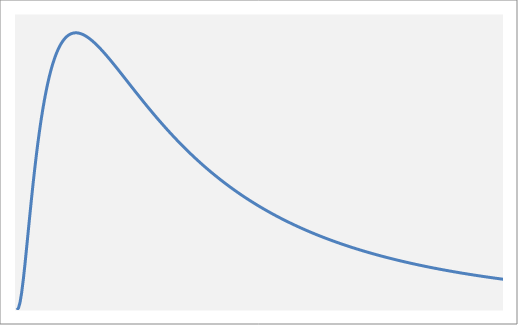
| Category | Series 0 |
|---|---|
| 0 | 0 |
| 1 | 0 |
| 2 | 0 |
| 3 | 0 |
| 4 | 0.001 |
| 5 | 0.001 |
| 6 | 0.001 |
| 7 | 0.002 |
| 8 | 0.002 |
| 9 | 0.003 |
| 10 | 0.003 |
| 11 | 0.003 |
| 12 | 0.004 |
| 13 | 0.004 |
| 14 | 0.004 |
| 15 | 0.005 |
| 16 | 0.005 |
| 17 | 0.005 |
| 18 | 0.005 |
| 19 | 0.005 |
| 20 | 0.006 |
| 21 | 0.006 |
| 22 | 0.006 |
| 23 | 0.006 |
| 24 | 0.006 |
| 25 | 0.006 |
| 26 | 0.006 |
| 27 | 0.006 |
| 28 | 0.006 |
| 29 | 0.006 |
| 30 | 0.006 |
| 31 | 0.006 |
| 32 | 0.007 |
| 33 | 0.007 |
| 34 | 0.007 |
| 35 | 0.007 |
| 36 | 0.007 |
| 37 | 0.007 |
| 38 | 0.007 |
| 39 | 0.007 |
| 40 | 0.007 |
| 41 | 0.007 |
| 42 | 0.007 |
| 43 | 0.006 |
| 44 | 0.006 |
| 45 | 0.006 |
| 46 | 0.006 |
| 47 | 0.006 |
| 48 | 0.006 |
| 49 | 0.006 |
| 50 | 0.006 |
| 51 | 0.006 |
| 52 | 0.006 |
| 53 | 0.006 |
| 54 | 0.006 |
| 55 | 0.006 |
| 56 | 0.006 |
| 57 | 0.006 |
| 58 | 0.006 |
| 59 | 0.006 |
| 60 | 0.006 |
| 61 | 0.006 |
| 62 | 0.006 |
| 63 | 0.006 |
| 64 | 0.006 |
| 65 | 0.006 |
| 66 | 0.006 |
| 67 | 0.005 |
| 68 | 0.005 |
| 69 | 0.005 |
| 70 | 0.005 |
| 71 | 0.005 |
| 72 | 0.005 |
| 73 | 0.005 |
| 74 | 0.005 |
| 75 | 0.005 |
| 76 | 0.005 |
| 77 | 0.005 |
| 78 | 0.005 |
| 79 | 0.005 |
| 80 | 0.005 |
| 81 | 0.005 |
| 82 | 0.005 |
| 83 | 0.005 |
| 84 | 0.005 |
| 85 | 0.005 |
| 86 | 0.005 |
| 87 | 0.005 |
| 88 | 0.004 |
| 89 | 0.004 |
| 90 | 0.004 |
| 91 | 0.004 |
| 92 | 0.004 |
| 93 | 0.004 |
| 94 | 0.004 |
| 95 | 0.004 |
| 96 | 0.004 |
| 97 | 0.004 |
| 98 | 0.004 |
| 99 | 0.004 |
| 100 | 0.004 |
| 101 | 0.004 |
| 102 | 0.004 |
| 103 | 0.004 |
| 104 | 0.004 |
| 105 | 0.004 |
| 106 | 0.004 |
| 107 | 0.004 |
| 108 | 0.004 |
| 109 | 0.004 |
| 110 | 0.004 |
| 111 | 0.004 |
| 112 | 0.004 |
| 113 | 0.003 |
| 114 | 0.003 |
| 115 | 0.003 |
| 116 | 0.003 |
| 117 | 0.003 |
| 118 | 0.003 |
| 119 | 0.003 |
| 120 | 0.003 |
| 121 | 0.003 |
| 122 | 0.003 |
| 123 | 0.003 |
| 124 | 0.003 |
| 125 | 0.003 |
| 126 | 0.003 |
| 127 | 0.003 |
| 128 | 0.003 |
| 129 | 0.003 |
| 130 | 0.003 |
| 131 | 0.003 |
| 132 | 0.003 |
| 133 | 0.003 |
| 134 | 0.003 |
| 135 | 0.003 |
| 136 | 0.003 |
| 137 | 0.003 |
| 138 | 0.003 |
| 139 | 0.003 |
| 140 | 0.003 |
| 141 | 0.003 |
| 142 | 0.003 |
| 143 | 0.003 |
| 144 | 0.003 |
| 145 | 0.003 |
| 146 | 0.003 |
| 147 | 0.003 |
| 148 | 0.002 |
| 149 | 0.002 |
| 150 | 0.002 |
| 151 | 0.002 |
| 152 | 0.002 |
| 153 | 0.002 |
| 154 | 0.002 |
| 155 | 0.002 |
| 156 | 0.002 |
| 157 | 0.002 |
| 158 | 0.002 |
| 159 | 0.002 |
| 160 | 0.002 |
| 161 | 0.002 |
| 162 | 0.002 |
| 163 | 0.002 |
| 164 | 0.002 |
| 165 | 0.002 |
| 166 | 0.002 |
| 167 | 0.002 |
| 168 | 0.002 |
| 169 | 0.002 |
| 170 | 0.002 |
| 171 | 0.002 |
| 172 | 0.002 |
| 173 | 0.002 |
| 174 | 0.002 |
| 175 | 0.002 |
| 176 | 0.002 |
| 177 | 0.002 |
| 178 | 0.002 |
| 179 | 0.002 |
| 180 | 0.002 |
| 181 | 0.002 |
| 182 | 0.002 |
| 183 | 0.002 |
| 184 | 0.002 |
| 185 | 0.002 |
| 186 | 0.002 |
| 187 | 0.002 |
| 188 | 0.002 |
| 189 | 0.002 |
| 190 | 0.002 |
| 191 | 0.002 |
| 192 | 0.002 |
| 193 | 0.002 |
| 194 | 0.002 |
| 195 | 0.002 |
| 196 | 0.002 |
| 197 | 0.002 |
| 198 | 0.002 |
| 199 | 0.002 |
| 200 | 0.002 |
| 201 | 0.002 |
| 202 | 0.002 |
| 203 | 0.002 |
| 204 | 0.002 |
| 205 | 0.001 |
| 206 | 0.001 |
| 207 | 0.001 |
| 208 | 0.001 |
| 209 | 0.001 |
| 210 | 0.001 |
| 211 | 0.001 |
| 212 | 0.001 |
| 213 | 0.001 |
| 214 | 0.001 |
| 215 | 0.001 |
| 216 | 0.001 |
| 217 | 0.001 |
| 218 | 0.001 |
| 219 | 0.001 |
| 220 | 0.001 |
| 221 | 0.001 |
| 222 | 0.001 |
| 223 | 0.001 |
| 224 | 0.001 |
| 225 | 0.001 |
| 226 | 0.001 |
| 227 | 0.001 |
| 228 | 0.001 |
| 229 | 0.001 |
| 230 | 0.001 |
| 231 | 0.001 |
| 232 | 0.001 |
| 233 | 0.001 |
| 234 | 0.001 |
| 235 | 0.001 |
| 236 | 0.001 |
| 237 | 0.001 |
| 238 | 0.001 |
| 239 | 0.001 |
| 240 | 0.001 |
| 241 | 0.001 |
| 242 | 0.001 |
| 243 | 0.001 |
| 244 | 0.001 |
| 245 | 0.001 |
| 246 | 0.001 |
| 247 | 0.001 |
| 248 | 0.001 |
| 249 | 0.001 |
| 250 | 0.001 |
| 251 | 0.001 |
| 252 | 0.001 |
| 253 | 0.001 |
| 254 | 0.001 |
| 255 | 0.001 |
| 256 | 0.001 |
| 257 | 0.001 |
| 258 | 0.001 |
| 259 | 0.001 |
| 260 | 0.001 |
| 261 | 0.001 |
| 262 | 0.001 |
| 263 | 0.001 |
| 264 | 0.001 |
| 265 | 0.001 |
| 266 | 0.001 |
| 267 | 0.001 |
| 268 | 0.001 |
| 269 | 0.001 |
| 270 | 0.001 |
| 271 | 0.001 |
| 272 | 0.001 |
| 273 | 0.001 |
| 274 | 0.001 |
| 275 | 0.001 |
| 276 | 0.001 |
| 277 | 0.001 |
| 278 | 0.001 |
| 279 | 0.001 |
| 280 | 0.001 |
| 281 | 0.001 |
| 282 | 0.001 |
| 283 | 0.001 |
| 284 | 0.001 |
| 285 | 0.001 |
| 286 | 0.001 |
| 287 | 0.001 |
| 288 | 0.001 |
| 289 | 0.001 |
| 290 | 0.001 |
| 291 | 0.001 |
| 292 | 0.001 |
| 293 | 0.001 |
| 294 | 0.001 |
| 295 | 0.001 |
| 296 | 0.001 |
| 297 | 0.001 |
| 298 | 0.001 |
| 299 | 0.001 |